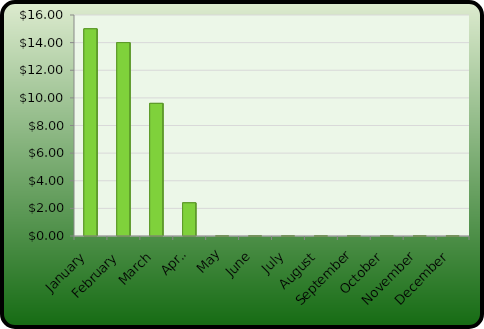
| Category | Series 0 |
|---|---|
| January | 15 |
| February | 14 |
| March | 9.6 |
| April | 2.4 |
| May | 0 |
| June | 0 |
| July | 0 |
| August | 0 |
| September | 0 |
| October | 0 |
| November | 0 |
| December | 0 |